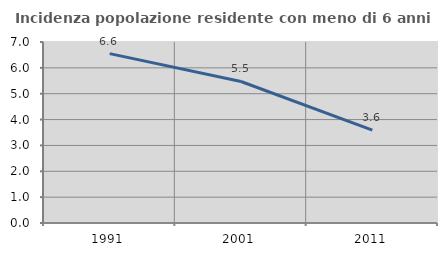
| Category | Incidenza popolazione residente con meno di 6 anni |
|---|---|
| 1991.0 | 6.55 |
| 2001.0 | 5.473 |
| 2011.0 | 3.59 |